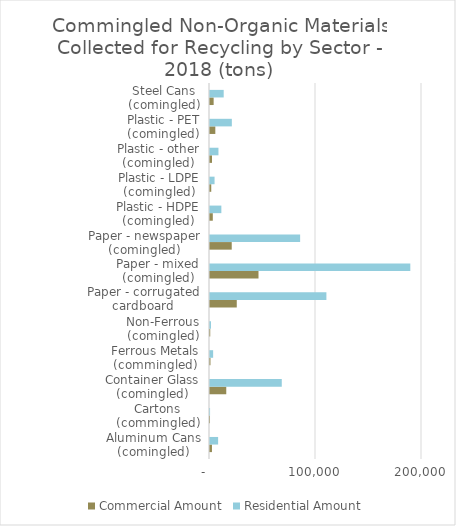
| Category | Commercial Amount | Residential Amount |
|---|---|---|
| Aluminum Cans (comingled) | 1846.873 | 7661.586 |
| Cartons (commingled) | 6 | 58 |
| Container Glass (comingled) | 15345.547 | 67705.824 |
| Ferrous Metals (commingled) | 441.477 | 2958.847 |
| Non-Ferrous (comingled) | 228.661 | 920.877 |
| Paper - corrugated cardboard (comingled) | 25249.753 | 109811.999 |
| Paper - mixed (comingled) | 45757.343 | 188973.74 |
| Paper - newspaper (comingled) | 20502.961 | 85024.183 |
| Plastic - HDPE (comingled) | 2645.421 | 10711.132 |
| Plastic - LDPE (comingled) | 1180.284 | 4295.857 |
| Plastic - other (comingled) | 1886.333 | 7970.811 |
| Plastic - PET (comingled) | 5019.463 | 20603.492 |
| Steel Cans (comingled) | 3436.786 | 12921.635 |